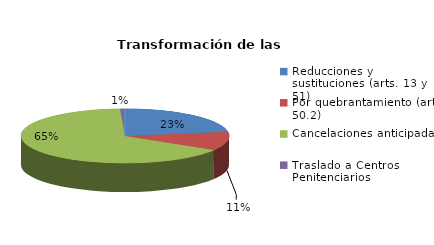
| Category | Series 0 |
|---|---|
| Reducciones y sustituciones (arts. 13 y 51) | 30 |
| Por quebrantamiento (art. 50.2) | 15 |
| Cancelaciones anticipadas | 87 |
| Traslado a Centros Penitenciarios | 1 |
| Conversión internamientos en cerrados (art. 51.2) | 0 |